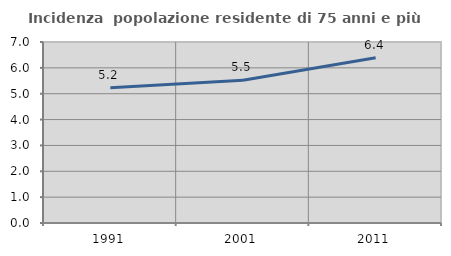
| Category | Incidenza  popolazione residente di 75 anni e più |
|---|---|
| 1991.0 | 5.234 |
| 2001.0 | 5.523 |
| 2011.0 | 6.392 |